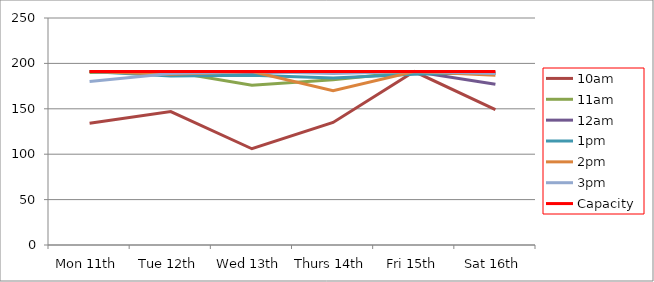
| Category | 9am | 10am | 11am | 12am | 1pm | 2pm | 3pm | 4pm | 5pm | Capacity |
|---|---|---|---|---|---|---|---|---|---|---|
| Mon 11th |  | 134 | 190 | 191 | 191 | 191 | 180 |  |  | 191 |
| Tue 12th |  | 147 | 191 | 191 | 186 | 188 | 189 |  |  | 191 |
| Wed 13th |  | 106 | 176 | 190 | 187 | 191 | 191 |  |  | 191 |
| Thurs 14th |  | 135 | 182 | 191 | 184 | 170 | 189 |  |  | 191 |
| Fri 15th |  | 191 | 191 | 191 | 188 | 191 | 191 |  |  | 191 |
| Sat 16th |  | 149 | 189 | 177 | 190 | 187 | 189 |  |  | 191 |